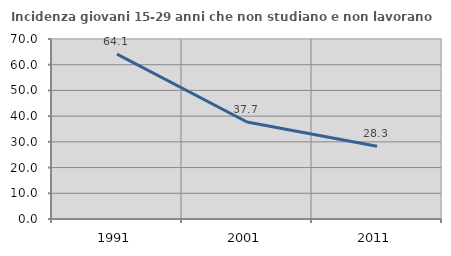
| Category | Incidenza giovani 15-29 anni che non studiano e non lavorano  |
|---|---|
| 1991.0 | 64.115 |
| 2001.0 | 37.73 |
| 2011.0 | 28.289 |